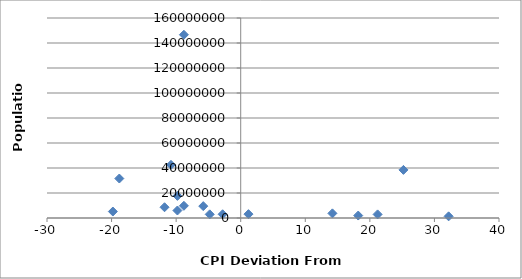
| Category | Population |
|---|---|
| -2.799999999999997 | 2998600 |
| -8.799999999999997 | 9754830 |
| -5.799999999999997 | 9498700 |
| 32.2 | 1315944 |
| 14.200000000000003 | 3720400 |
| -9.799999999999997 | 17693500 |
| -9.799999999999997 | 6000000 |
| 18.200000000000003 | 1973700 |
| 21.200000000000003 | 2875593 |
| -4.799999999999997 | 2913281 |
| 1.2000000000000028 | 3081677 |
| 25.200000000000003 | 38483957 |
| -8.799999999999997 | 146600000 |
| -11.799999999999997 | 8610000 |
| -19.799999999999997 | 5171943 |
| -10.799999999999997 | 42539010 |
| -18.799999999999997 | 31576400 |